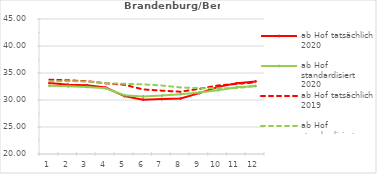
| Category | ab Hof tatsächlich 2020 | ab Hof standardisiert 2020 | ab Hof tatsächlich 2019 | ab Hof standardisiert 2019 |
|---|---|---|---|---|
| 0 | 33.129 | 32.634 | 33.774 | 33.469 |
| 1 | 32.837 | 32.545 | 33.648 | 33.484 |
| 2 | 32.732 | 32.406 | 33.49 | 33.414 |
| 3 | 32.318 | 32.173 | 33.089 | 33.099 |
| 4 | 30.717 | 30.879 | 32.818 | 33.001 |
| 5 | 30.065 | 30.66 | 31.963 | 32.893 |
| 6 | 30.168 | 30.813 | 31.728 | 32.682 |
| 7 | 30.298 | 31.086 | 31.531 | 32.326 |
| 8 | 31.278 | 31.391 | 32.072 | 32.201 |
| 9 | 32.429 | 31.826 | 32.697 | 32.177 |
| 10 | 33.103 | 32.376 | 32.992 | 32.211 |
| 11 | 33.438 | 32.581 | 33.258 | 32.579 |